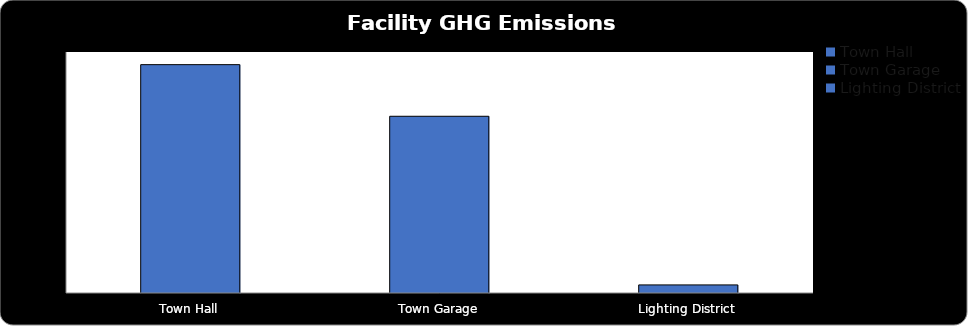
| Category | Series 0 |
|---|---|
| Town Hall | 15.16 |
| Town Garage | 11.733 |
| Lighting District | 0.537 |